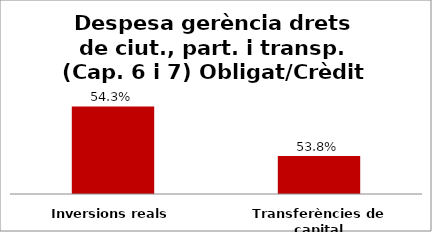
| Category | Series 0 |
|---|---|
| Inversions reals | 0.543 |
| Transferències de capital | 0.538 |